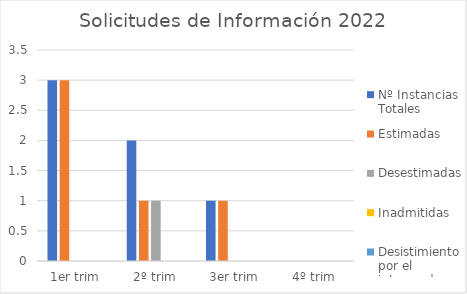
| Category | Nº Instancias Totales | Estimadas | Desestimadas | Inadmitidas | Desistimiento por el interesado |
|---|---|---|---|---|---|
| 1er trim | 3 | 3 | 0 | 0 | 0 |
| 2º trim | 2 | 1 | 1 | 0 | 0 |
| 3er trim | 1 | 1 | 0 | 0 | 0 |
| 4º trim | 0 | 0 | 0 | 0 | 0 |